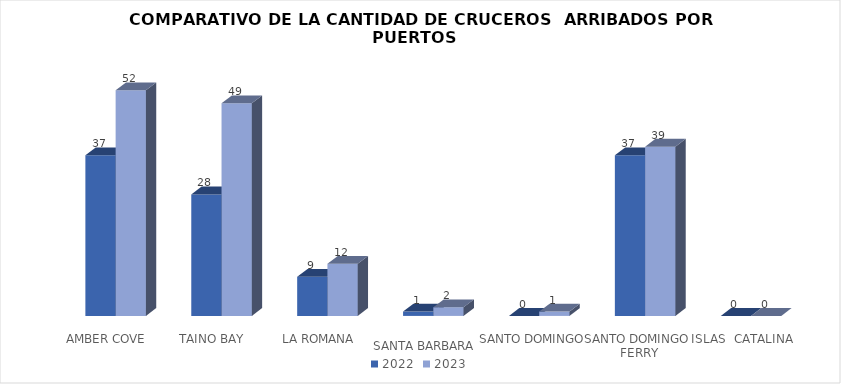
| Category | 2022 | 2023 |
|---|---|---|
| AMBER COVE | 37 | 52 |
| TAINO BAY | 28 | 49 |
| LA ROMANA | 9 | 12 |
| SANTA BARBARA  | 1 | 2 |
| SANTO DOMINGO | 0 | 1 |
| SANTO DOMINGO  FERRY | 37 | 39 |
| ISLAS  CATALINA  | 0 | 0 |